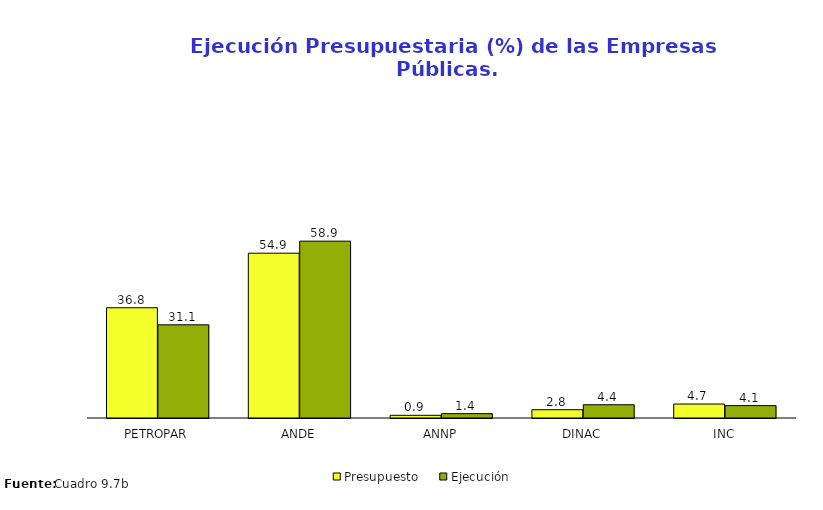
| Category | Presupuesto | Ejecución |
|---|---|---|
| PETROPAR | 36.752 | 31.068 |
| ANDE | 54.932 | 58.945 |
| ANNP | 0.898 | 1.448 |
| DINAC | 2.756 | 4.413 |
| INC | 4.661 | 4.126 |